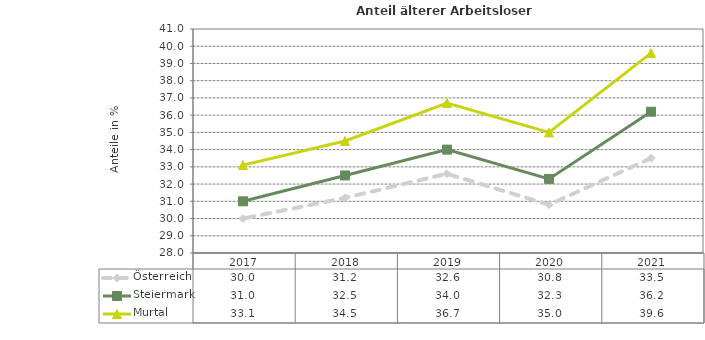
| Category | Österreich | Steiermark | Murtal |
|---|---|---|---|
| 2021.0 | 33.5 | 36.2 | 39.6 |
| 2020.0 | 30.8 | 32.3 | 35 |
| 2019.0 | 32.6 | 34 | 36.7 |
| 2018.0 | 31.2 | 32.5 | 34.5 |
| 2017.0 | 30 | 31 | 33.1 |